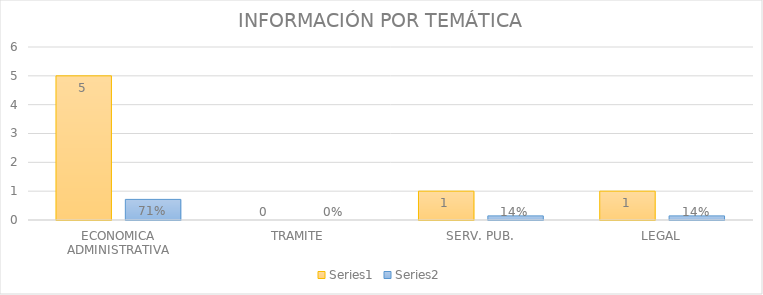
| Category | Series 3 | Series 4 |
|---|---|---|
| ECONOMICA ADMINISTRATIVA | 5 | 0.714 |
| TRAMITE | 0 | 0 |
| SERV. PUB. | 1 | 0.143 |
| LEGAL | 1 | 0.143 |